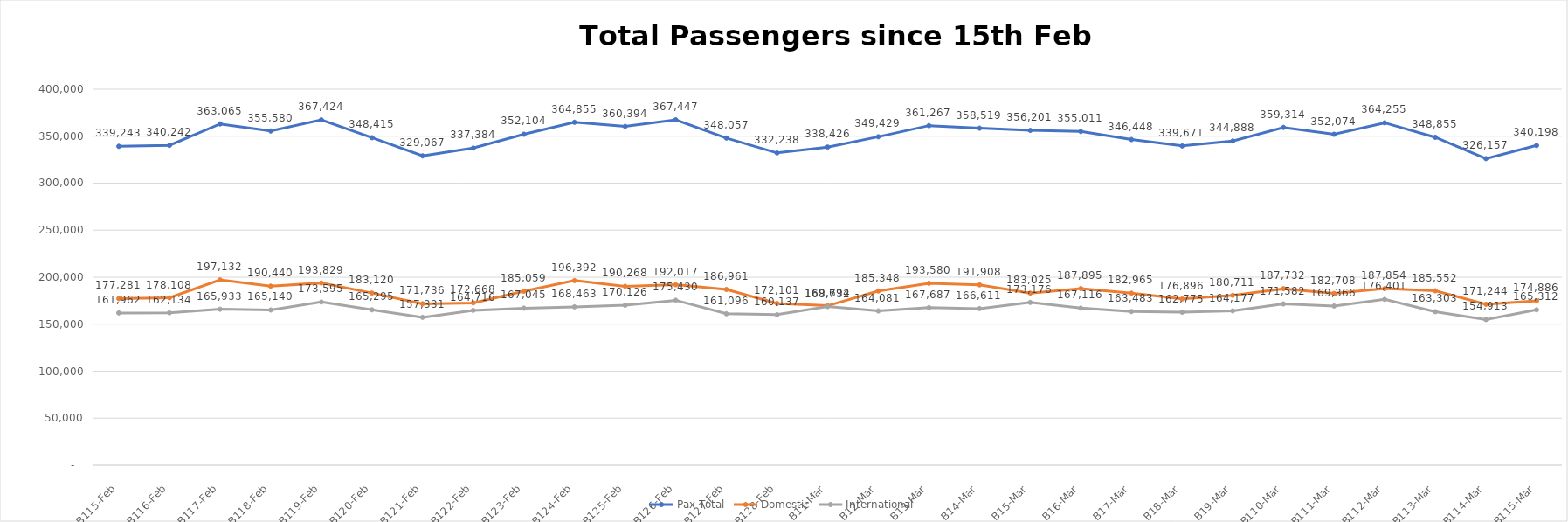
| Category | Pax Total |  Domestic  |  International  |
|---|---|---|---|
| 2023-02-15 | 339243 | 177281 | 161962 |
| 2023-02-16 | 340242 | 178108 | 162134 |
| 2023-02-17 | 363065 | 197132 | 165933 |
| 2023-02-18 | 355580 | 190440 | 165140 |
| 2023-02-19 | 367424 | 193829 | 173595 |
| 2023-02-20 | 348415 | 183120 | 165295 |
| 2023-02-21 | 329067 | 171736 | 157331 |
| 2023-02-22 | 337384 | 172668 | 164716 |
| 2023-02-23 | 352104 | 185059 | 167045 |
| 2023-02-24 | 364855 | 196392 | 168463 |
| 2023-02-25 | 360394 | 190268 | 170126 |
| 2023-02-26 | 367447 | 192017 | 175430 |
| 2023-02-27 | 348057 | 186961 | 161096 |
| 2023-02-28 | 332238 | 172101 | 160137 |
| 2023-03-01 | 338426 | 169694 | 168732 |
| 2023-03-02 | 349429 | 185348 | 164081 |
| 2023-03-03 | 361267 | 193580 | 167687 |
| 2023-03-04 | 358519 | 191908 | 166611 |
| 2023-03-05 | 356201 | 183025 | 173176 |
| 2023-03-06 | 355011 | 187895 | 167116 |
| 2023-03-07 | 346448 | 182965 | 163483 |
| 2023-03-08 | 339671 | 176896 | 162775 |
| 2023-03-09 | 344888 | 180711 | 164177 |
| 2023-03-10 | 359314 | 187732 | 171582 |
| 2023-03-11 | 352074 | 182708 | 169366 |
| 2023-03-12 | 364255 | 187854 | 176401 |
| 2023-03-13 | 348855 | 185552 | 163303 |
| 2023-03-14 | 326157 | 171244 | 154913 |
| 2023-03-15 | 340198 | 174886 | 165312 |